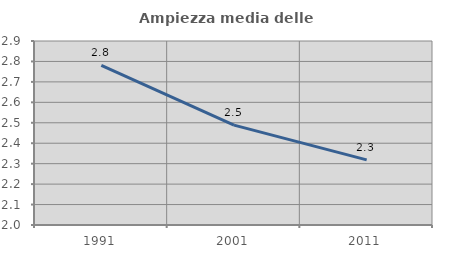
| Category | Ampiezza media delle famiglie |
|---|---|
| 1991.0 | 2.781 |
| 2001.0 | 2.489 |
| 2011.0 | 2.319 |